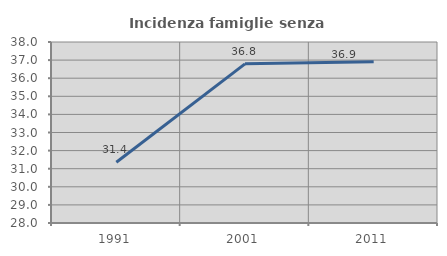
| Category | Incidenza famiglie senza nuclei |
|---|---|
| 1991.0 | 31.357 |
| 2001.0 | 36.792 |
| 2011.0 | 36.909 |